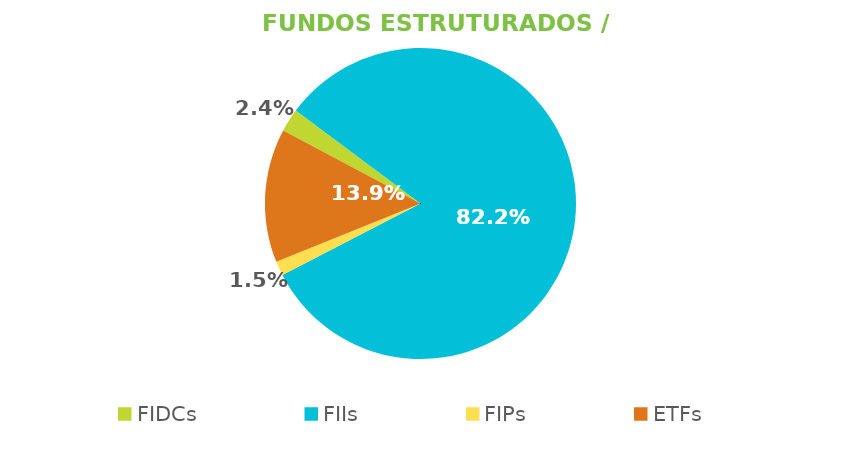
| Category | Fundos Estruturados / ETFs |
|---|---|
| FIDCs | 0.024 |
| FIIs | 0.822 |
| FIPs | 0.015 |
| ETFs | 0.139 |